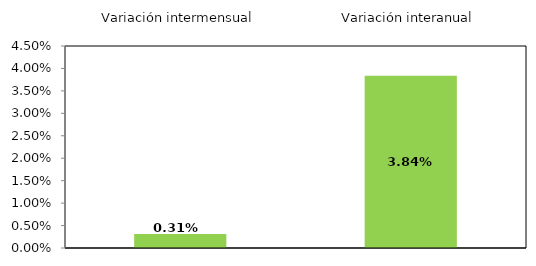
| Category | Series 0 |
|---|---|
| 0 | 0.314 |
| 1 | 3.84 |